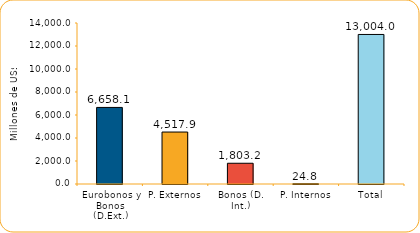
| Category | Series 1 |
|---|---|
| Eurobonos y Bonos (D.Ext.) | 6658.1 |
| P. Externos | 4517.9 |
| Bonos (D. Int.) | 1803.2 |
| P. Internos | 24.8 |
| Total | 13004 |